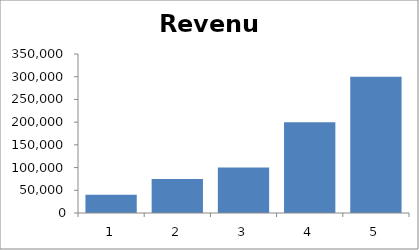
| Category | Revenue |
|---|---|
| 0 | 40000 |
| 1 | 75000 |
| 2 | 100000 |
| 3 | 200000 |
| 4 | 300000 |